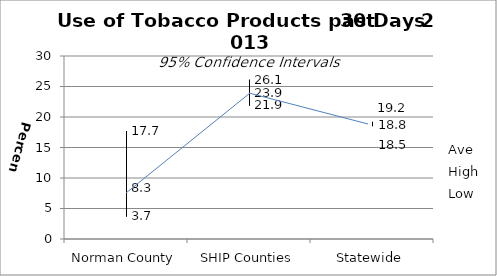
| Category | Ave | High | Low |
|---|---|---|---|
| Norman County | 8.3 | 17.7 | 3.7 |
| SHIP Counties | 23.9 | 26.1 | 21.9 |
| Statewide | 18.8 | 19.2 | 18.5 |